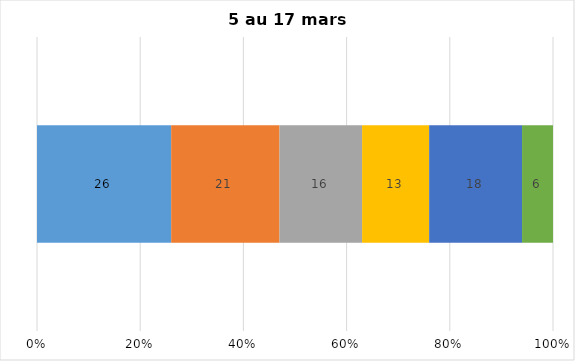
| Category | Plusieurs fois par jour | Une fois par jour | Quelques fois par semaine   | Une fois par semaine ou moins   |  Jamais   |  Je n’utilise pas les médias sociaux |
|---|---|---|---|---|---|---|
| 0 | 26 | 21 | 16 | 13 | 18 | 6 |